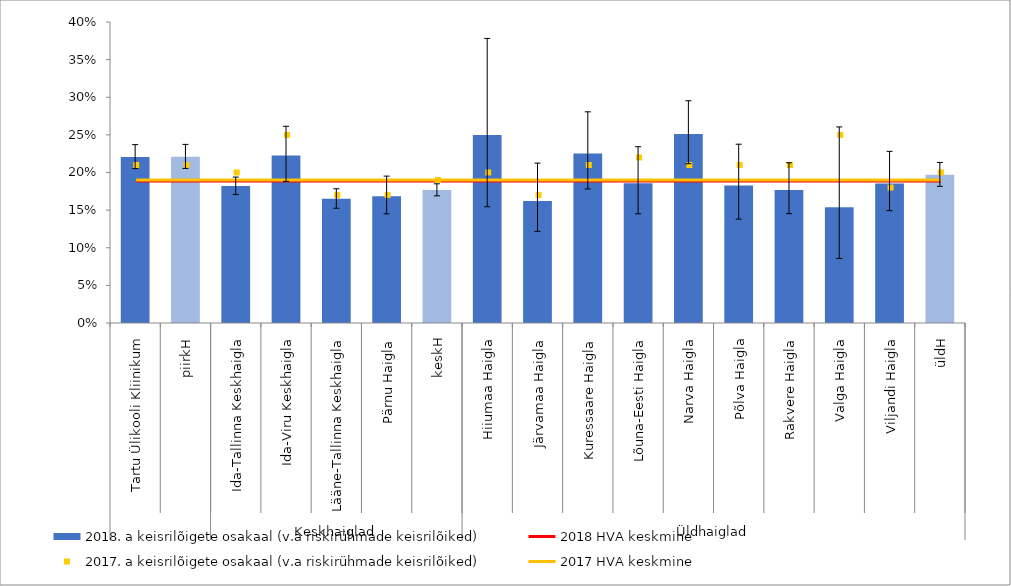
| Category | 2018. a keisrilõigete osakaal (v.a riskirühmade keisrilõiked) |
|---|---|
| 0 | 0.221 |
| 1 | 0.221 |
| 2 | 0.182 |
| 3 | 0.223 |
| 4 | 0.165 |
| 5 | 0.168 |
| 6 | 0.177 |
| 7 | 0.25 |
| 8 | 0.162 |
| 9 | 0.225 |
| 10 | 0.186 |
| 11 | 0.251 |
| 12 | 0.183 |
| 13 | 0.177 |
| 14 | 0.154 |
| 15 | 0.185 |
| 16 | 0.197 |